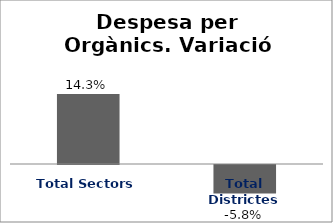
| Category | Series 0 |
|---|---|
| Total Sectors | 0.143 |
| Total Districtes | -0.058 |